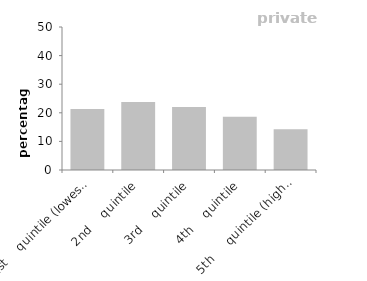
| Category | private renters |
|---|---|
| 1st    quintile (lowest incomes) | 21.348 |
| 2nd    quintile | 23.741 |
| 3rd    quintile | 22.034 |
| 4th    quintile | 18.631 |
| 5th     quintile (highest incomes) | 14.246 |